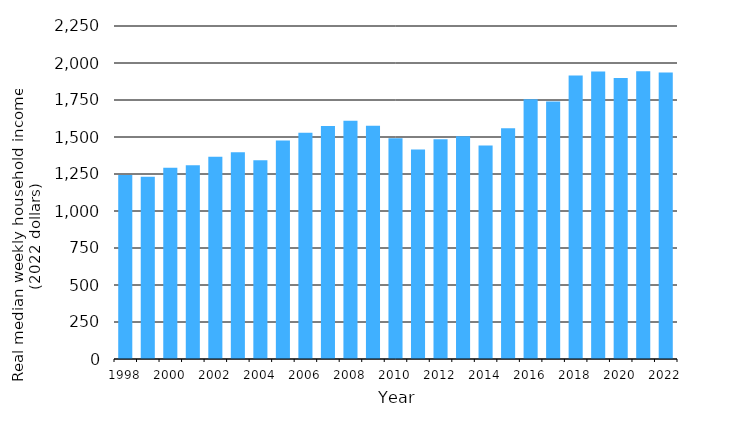
| Category | Real median weekly household income (2022 dollars) |
|---|---|
| 1998.0 | 1242.726 |
| 1999.0 | 1231.859 |
| 2000.0 | 1291.573 |
| 2001.0 | 1309.589 |
| 2002.0 | 1366.202 |
| 2003.0 | 1396.156 |
| 2004.0 | 1342.551 |
| 2005.0 | 1475.637 |
| 2006.0 | 1528.721 |
| 2007.0 | 1574.102 |
| 2008.0 | 1609.866 |
| 2009.0 | 1576.131 |
| 2010.0 | 1490.739 |
| 2011.0 | 1414.778 |
| 2012.0 | 1485.541 |
| 2013.0 | 1505.695 |
| 2014.0 | 1442.448 |
| 2015.0 | 1558.612 |
| 2016.0 | 1755.317 |
| 2017.0 | 1739.183 |
| 2018.0 | 1915.941 |
| 2019.0 | 1941.759 |
| 2020.0 | 1898.415 |
| 2021.0 | 1944.308 |
| 2022.0 | 1935 |